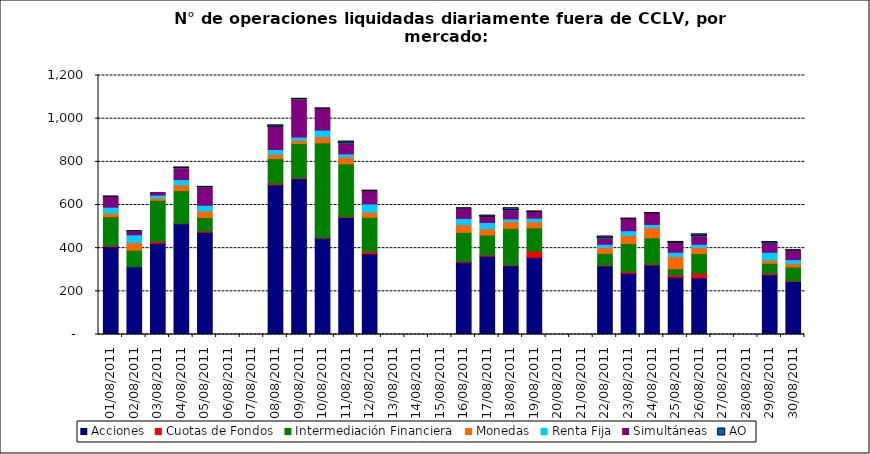
| Category | Acciones | Cuotas de Fondos | Intermediación Financiera | Monedas | Renta Fija | Simultáneas | AO |
|---|---|---|---|---|---|---|---|
| 01/08/2011 | 408 | 5 | 133 | 17 | 27 | 46 | 3 |
| 02/08/2011 | 314 | 0 | 77 | 35 | 36 | 14 | 2 |
| 03/08/2011 | 423 | 8 | 191 | 11 | 13 | 12 | 0 |
| 04/08/2011 | 513 | 2 | 152 | 26 | 25 | 50 | 6 |
| 05/08/2011 | 474 | 5 | 63 | 30 | 27 | 80 | 5 |
| 08/08/2011 | 694 | 6 | 115 | 20 | 22 | 103 | 9 |
| 09/08/2011 | 722 | 3 | 160 | 15 | 15 | 172 | 5 |
| 10/08/2011 | 446 | 4 | 438 | 28 | 31 | 98 | 1 |
| 11/08/2011 | 542 | 4 | 245 | 31 | 15 | 46 | 11 |
| 12/08/2011 | 374 | 10 | 159 | 24 | 38 | 59 | 1 |
| 16/08/2011 | 335 | 5 | 133 | 36 | 29 | 44 | 2 |
| 17/08/2011 | 363 | 5 | 93 | 29 | 29 | 24 | 8 |
| 18/08/2011 | 319 | 3 | 170 | 31 | 13 | 38 | 11 |
| 19/08/2011 | 358 | 27 | 109 | 28 | 17 | 27 | 4 |
| 22/08/2011 | 318 | 4 | 54 | 27 | 15 | 25 | 11 |
| 23/08/2011 | 284 | 7 | 131 | 37 | 22 | 52 | 4 |
| 24/08/2011 | 322 | 4 | 122 | 47 | 15 | 50 | 1 |
| 25/08/2011 | 266 | 10 | 29 | 56 | 20 | 41 | 7 |
| 26/08/2011 | 263 | 20 | 92 | 28 | 15 | 35 | 11 |
| 29/08/2011 | 278 | 6 | 46 | 15 | 36 | 38 | 9 |
| 30/08/2011 | 246 | 3 | 64 | 16 | 18 | 40 | 3 |